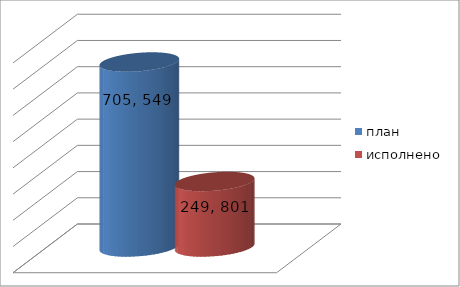
| Category | план | исполнено |
|---|---|---|
| 0 | 705549443.63 | 249801160.39 |